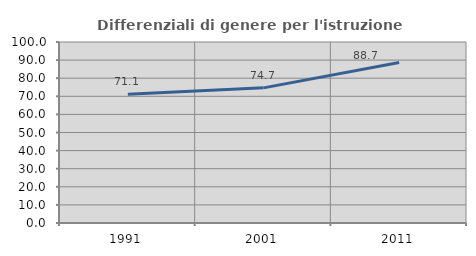
| Category | Differenziali di genere per l'istruzione superiore |
|---|---|
| 1991.0 | 71.082 |
| 2001.0 | 74.657 |
| 2011.0 | 88.69 |